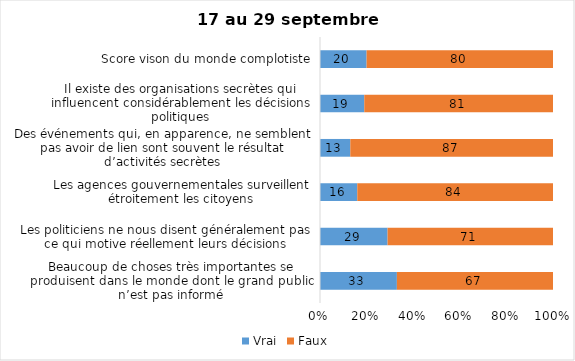
| Category | Vrai | Faux |
|---|---|---|
| Beaucoup de choses très importantes se produisent dans le monde dont le grand public n’est pas informé | 33 | 67 |
| Les politiciens ne nous disent généralement pas ce qui motive réellement leurs décisions | 29 | 71 |
| Les agences gouvernementales surveillent étroitement les citoyens | 16 | 84 |
| Des événements qui, en apparence, ne semblent pas avoir de lien sont souvent le résultat d’activités secrètes | 13 | 87 |
| Il existe des organisations secrètes qui influencent considérablement les décisions politiques | 19 | 81 |
| Score vison du monde complotiste | 20 | 80 |